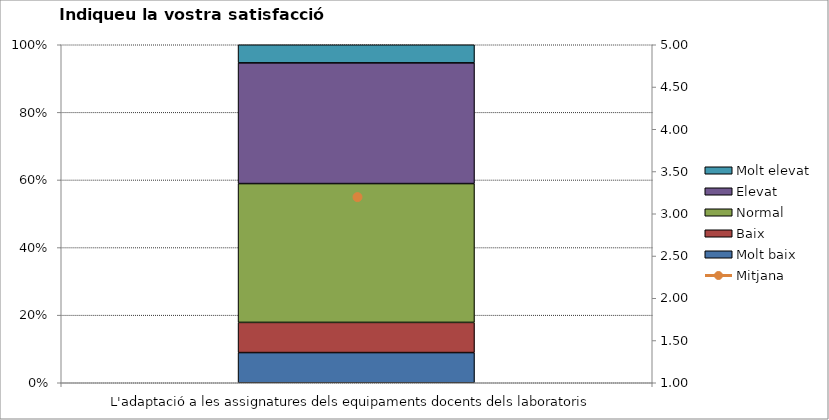
| Category | Molt baix | Baix | Normal  | Elevat | Molt elevat |
|---|---|---|---|---|---|
| L'adaptació a les assignatures dels equipaments docents dels laboratoris | 5 | 5 | 23 | 20 | 3 |